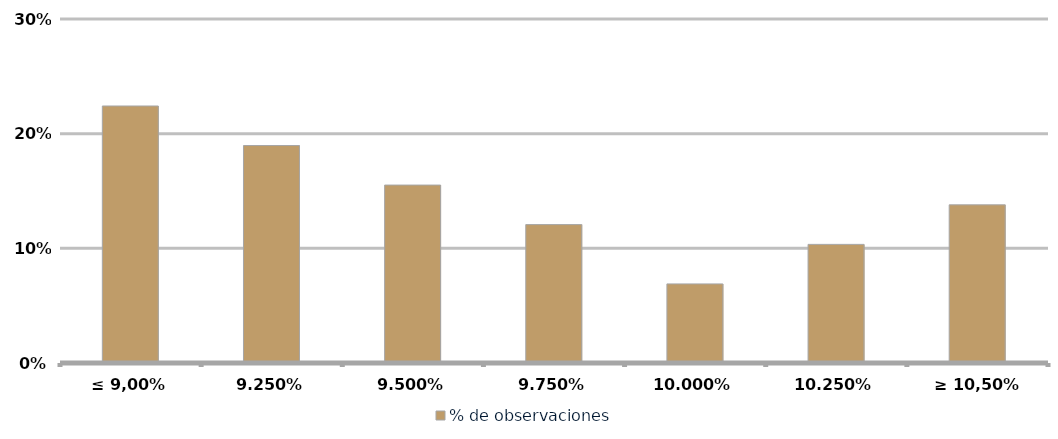
| Category | % de observaciones  |
|---|---|
| ≤ 9,00% | 0.224 |
| 9,25% | 0.19 |
| 9,50% | 0.155 |
| 9,75% | 0.121 |
| 10,00% | 0.069 |
| 10,25% | 0.103 |
| ≥ 10,50% | 0.138 |